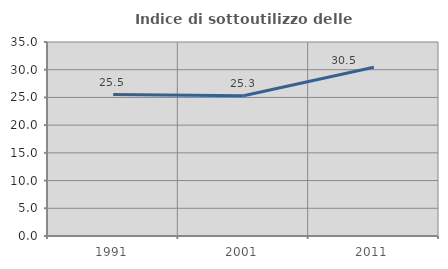
| Category | Indice di sottoutilizzo delle abitazioni  |
|---|---|
| 1991.0 | 25.51 |
| 2001.0 | 25.294 |
| 2011.0 | 30.455 |